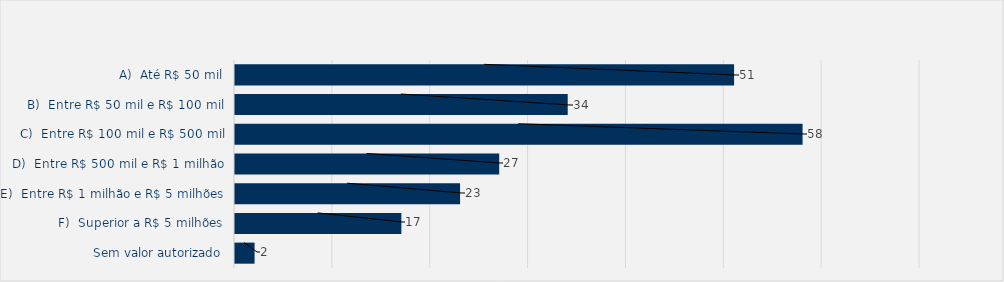
| Category | Total |
|---|---|
| A)  Até R$ 50 mil | 51 |
| B)  Entre R$ 50 mil e R$ 100 mil | 34 |
| C)  Entre R$ 100 mil e R$ 500 mil | 58 |
| D)  Entre R$ 500 mil e R$ 1 milhão | 27 |
| E)  Entre R$ 1 milhão e R$ 5 milhões | 23 |
| F)  Superior a R$ 5 milhões | 17 |
| Sem valor autorizado | 2 |